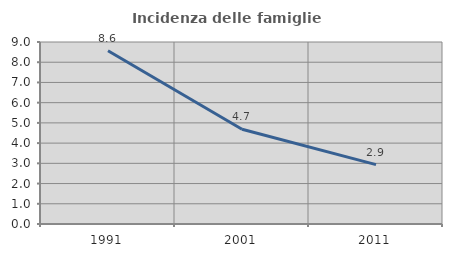
| Category | Incidenza delle famiglie numerose |
|---|---|
| 1991.0 | 8.565 |
| 2001.0 | 4.686 |
| 2011.0 | 2.936 |